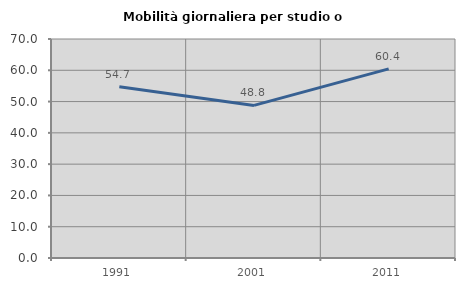
| Category | Mobilità giornaliera per studio o lavoro |
|---|---|
| 1991.0 | 54.721 |
| 2001.0 | 48.777 |
| 2011.0 | 60.438 |